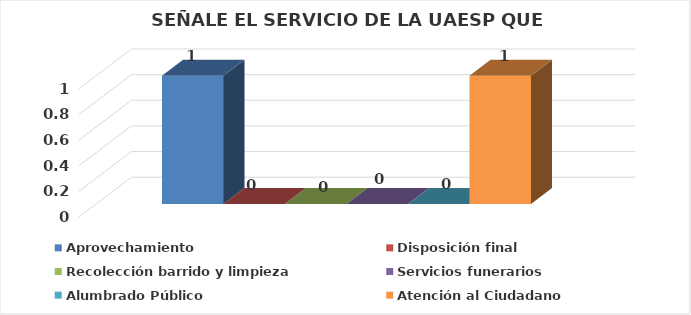
| Category | Aprovechamiento | Disposición final | Recolección barrido y limpieza | Servicios funerarios | Alumbrado Público | Atención al Ciudadano |
|---|---|---|---|---|---|---|
| 0 | 1 | 0 | 0 | 0 | 0 | 1 |